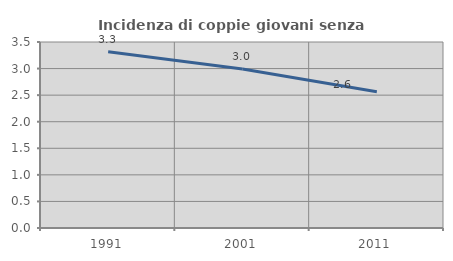
| Category | Incidenza di coppie giovani senza figli |
|---|---|
| 1991.0 | 3.315 |
| 2001.0 | 2.993 |
| 2011.0 | 2.564 |